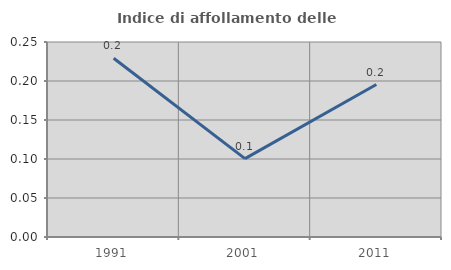
| Category | Indice di affollamento delle abitazioni  |
|---|---|
| 1991.0 | 0.229 |
| 2001.0 | 0.101 |
| 2011.0 | 0.196 |